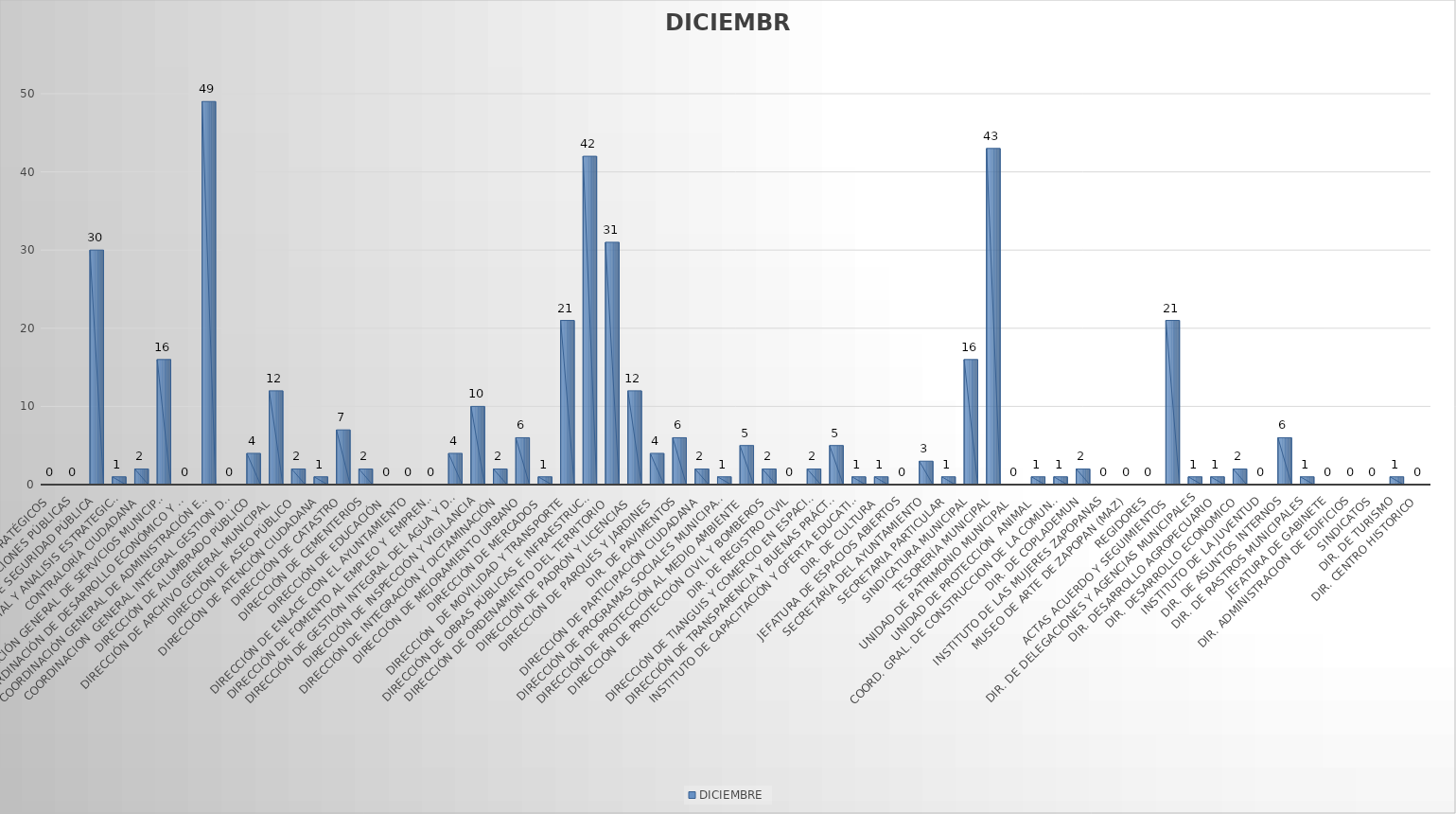
| Category | DICIEMBRE |
|---|---|
| Area de Proyectos Estratégicos | 0 |
| Área de Relaciones Públicas | 0 |
| Comisaria de Seguridad Pública | 30 |
| Comunicación Social y Analisis Estrategico  | 1 |
| Contraloría Ciudadana | 2 |
| Coordinación General de Servicios Municipales | 16 |
| Coordinación de Desarrollo Económico Y Combate a la Desigualdad | 0 |
| Coordinación General de Administración e Innovación Gubernamental | 49 |
| Coordinacion  General Integral Gestion de la Ciudad | 0 |
| Dirección de Alumbrado Público | 4 |
| Dirección de Archivo General Municipal  | 12 |
| Dirección de Aseo Público  | 2 |
| Dirección de Atención Ciudadana | 1 |
| Dirección de Catastro | 7 |
| Dirección de Cementerios | 2 |
| Dirección de Educación  | 0 |
| Dirección de Enlace con el ayuntamiento | 0 |
| Dirección de Fomento al empleo y  emprendurismo         | 0 |
| Dirección de Gestión Integral del Agua y Drenaje | 4 |
| Dirección de Inspección y Vigilancia | 10 |
| Dirección de Integración y Dictaminación | 2 |
| Dirección de Mejoramiento Urbano | 6 |
| Dirección de Mercados  | 1 |
| Dirección  de Movilidad y Transporte | 21 |
| Dirección de Obras Públicas e Infraestructura | 42 |
| Dirección de Ordenamiento del Territorio  | 31 |
| Dirección de padrón y Licencias  | 12 |
| Dirección de Parques y Jardines  | 4 |
| Dir. de Pavimentos | 6 |
| Dirección de Participación Ciudadana | 2 |
| Dirección de Programas Sociales Municipales | 1 |
| Dirección de Protección al Medio Ambiente  | 5 |
| Dirección de Protección Civil y Bomberos | 2 |
| Dir. de Registro Civil | 0 |
| Dirección de Tianguis y Comercio en espacios Abiertos | 2 |
| Dirección de Transparencia y Buenas Prácticas | 5 |
| Instituto de Capacitación y Oferta Educativa | 1 |
| Dir. de Cultura  | 1 |
| Jefatura de espacios abiertos | 0 |
| Secretaría del Ayuntamiento | 3 |
| Secretaria Particular | 1 |
| Sindicatura Municipal | 16 |
| Tesorería Municipal | 43 |
| Unidad de Patrimonio Municipal  | 0 |
| Unidad de Protección  Animal  | 1 |
| Coord. Gral. De Construccion de la Comunidad | 1 |
| Dir. De Coplademun | 2 |
| Instituto de las Mujeres Zapopanas | 0 |
| Museo De Arte de Zapopan (MAZ) | 0 |
| Regidores | 0 |
| Actas Acuerdo y Seguimientos  | 21 |
| Dir. De Delegaciones y Agencias Municipales | 1 |
|  Dir. Desarrollo Agropecuario | 1 |
| Dir. Desarrollo Economico | 2 |
| Instituto de la Juventud | 0 |
| Dir. De Asuntos Internos | 6 |
| Dir. De Rastros Municipales | 1 |
| Jefatura de Gabinete | 0 |
| Dir. Administracion de Edificios | 0 |
| Sindicatos | 0 |
| Dir. De Turismo | 1 |
| Dir. Centro Historico | 0 |